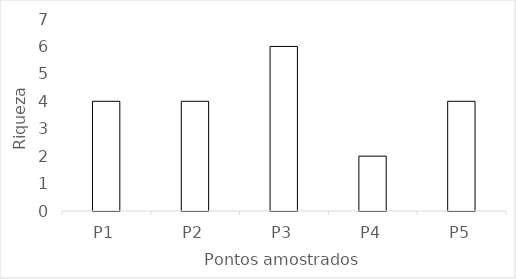
| Category | Series 0 |
|---|---|
| P1 | 4 |
| P2 | 4 |
| P3 | 6 |
| P4 | 2 |
| P5 | 4 |